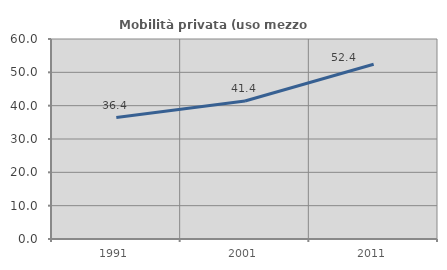
| Category | Mobilità privata (uso mezzo privato) |
|---|---|
| 1991.0 | 36.424 |
| 2001.0 | 41.414 |
| 2011.0 | 52.432 |